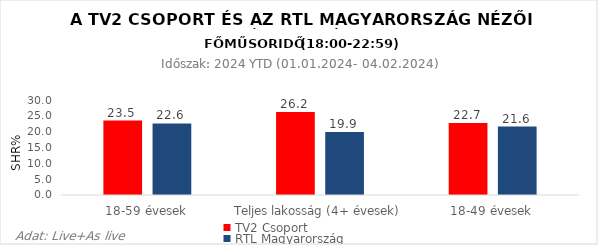
| Category | TV2 Csoport | RTL Magyarország |
|---|---|---|
| 18-59 évesek | 23.5 | 22.6 |
| Teljes lakosság (4+ évesek) | 26.2 | 19.9 |
| 18-49 évesek | 22.7 | 21.6 |